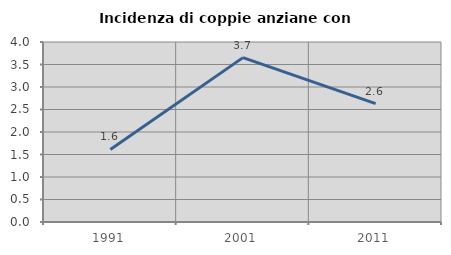
| Category | Incidenza di coppie anziane con figli |
|---|---|
| 1991.0 | 1.613 |
| 2001.0 | 3.653 |
| 2011.0 | 2.632 |